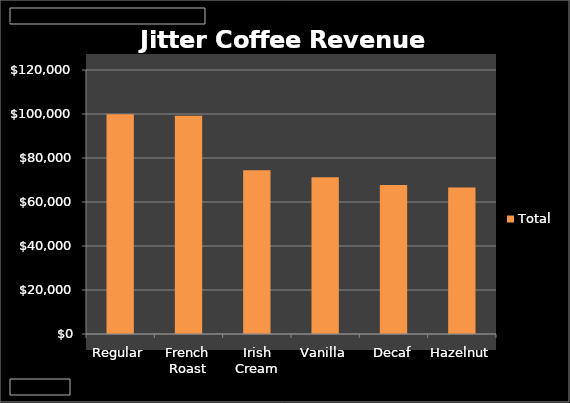
| Category | Total |
|---|---|
| Regular | 99910 |
| French Roast | 99204 |
| Irish Cream | 74420 |
| Vanilla | 71276 |
| Decaf | 67710 |
| Hazelnut | 66560 |